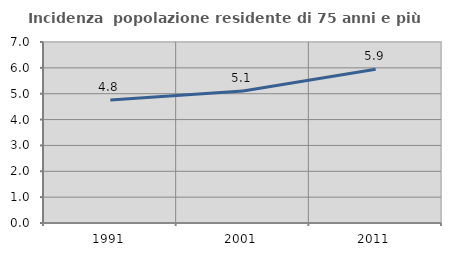
| Category | Incidenza  popolazione residente di 75 anni e più |
|---|---|
| 1991.0 | 4.754 |
| 2001.0 | 5.104 |
| 2011.0 | 5.948 |